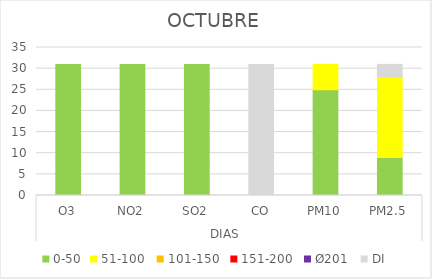
| Category | 0-50 | 51-100  | 101-150  | 151-200  | Ø201  | DI |
|---|---|---|---|---|---|---|
| 0 | 31 | 0 | 0 | 0 | 0 | 0 |
| 1 | 31 | 0 | 0 | 0 | 0 | 0 |
| 2 | 31 | 0 | 0 | 0 | 0 | 0 |
| 3 | 0 | 0 | 0 | 0 | 0 | 31 |
| 4 | 25 | 6 | 0 | 0 | 0 | 0 |
| 5 | 9 | 19 | 0 | 0 | 0 | 3 |